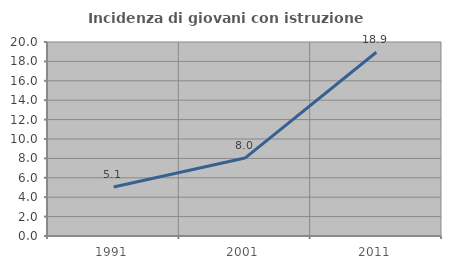
| Category | Incidenza di giovani con istruzione universitaria |
|---|---|
| 1991.0 | 5.051 |
| 2001.0 | 8.036 |
| 2011.0 | 18.947 |